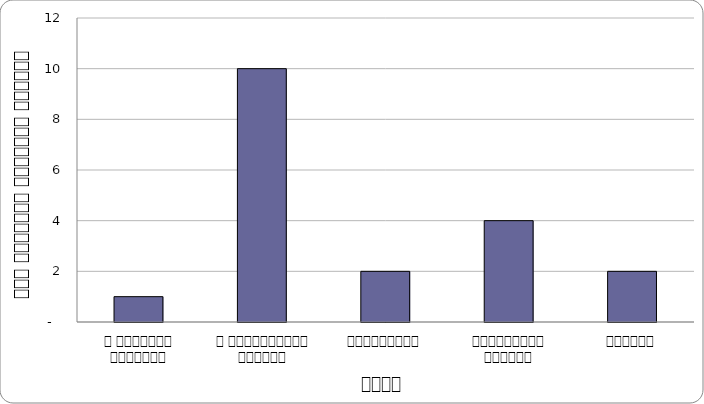
| Category | शासन |
|---|---|
| द हिमालयन टाइम्स् | 1 |
| द काठमाण्डौं पोस्ट् | 10 |
| कान्तिपुर | 2 |
| अन्नपूर्ण पोस्ट् | 4 |
| नागरिक | 2 |